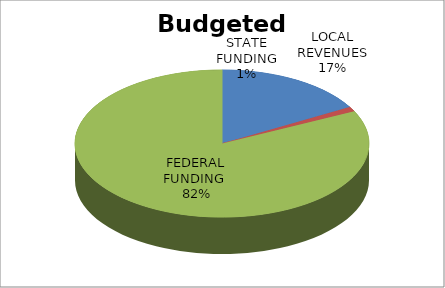
| Category | Budgeted Revenues |
|---|---|
| LOCAL REVENUES | 818148 |
| STATE FUNDING | 51343 |
| FEDERAL FUNDING  | 4018616 |